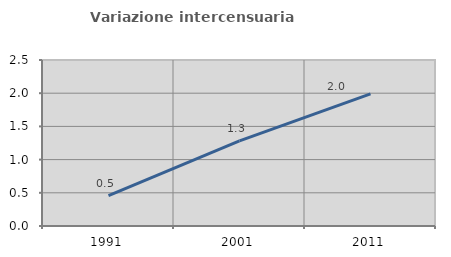
| Category | Variazione intercensuaria annua |
|---|---|
| 1991.0 | 0.459 |
| 2001.0 | 1.283 |
| 2011.0 | 1.989 |